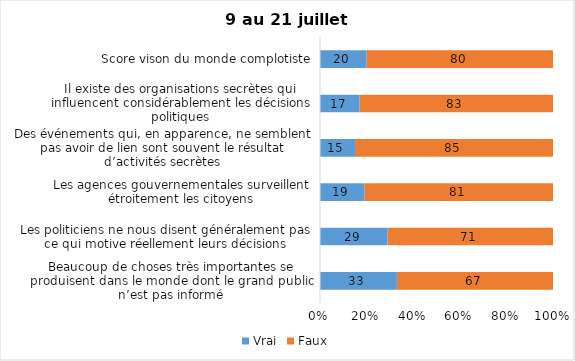
| Category | Vrai | Faux |
|---|---|---|
| Beaucoup de choses très importantes se produisent dans le monde dont le grand public n’est pas informé | 33 | 67 |
| Les politiciens ne nous disent généralement pas ce qui motive réellement leurs décisions | 29 | 71 |
| Les agences gouvernementales surveillent étroitement les citoyens | 19 | 81 |
| Des événements qui, en apparence, ne semblent pas avoir de lien sont souvent le résultat d’activités secrètes | 15 | 85 |
| Il existe des organisations secrètes qui influencent considérablement les décisions politiques | 17 | 83 |
| Score vison du monde complotiste | 20 | 80 |